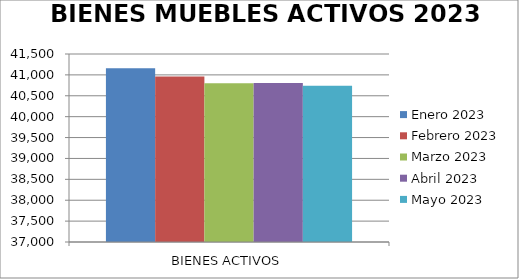
| Category | Enero 2023 | Febrero 2023 | Marzo 2023 | Abril 2023 | Mayo 2023 |
|---|---|---|---|---|---|
| BIENES ACTIVOS | 41160 | 40959 | 40800 | 40803 | 40743 |